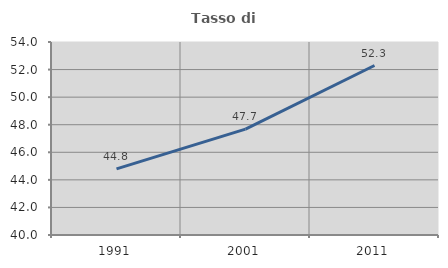
| Category | Tasso di occupazione   |
|---|---|
| 1991.0 | 44.8 |
| 2001.0 | 47.679 |
| 2011.0 | 52.294 |